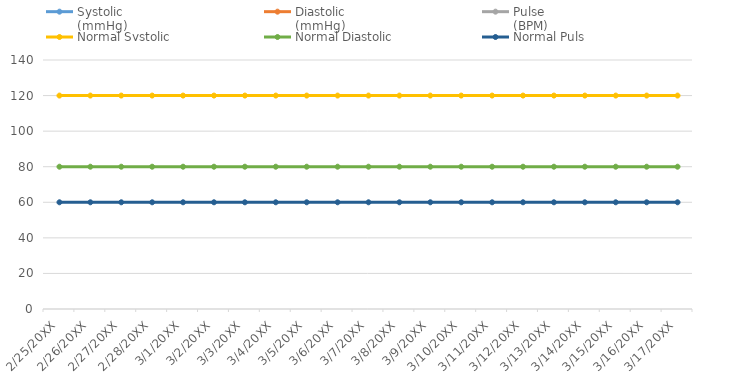
| Category | Systolic 
(mmHg) | Diastolic 
(mmHg) | Pulse 
(BPM) | Normal Systolic | Normal Diastolic | Normal Puls |
|---|---|---|---|---|---|---|
| 2/25/20XX |  |  |  | 120 | 80 | 60 |
| 2/26/20XX |  |  |  | 120 | 80 | 60 |
| 2/27/20XX |  |  |  | 120 | 80 | 60 |
| 2/28/20XX |  |  |  | 120 | 80 | 60 |
| 3/1/20XX |  |  |  | 120 | 80 | 60 |
| 3/2/20XX |  |  |  | 120 | 80 | 60 |
| 3/3/20XX |  |  |  | 120 | 80 | 60 |
| 3/4/20XX |  |  |  | 120 | 80 | 60 |
| 3/5/20XX |  |  |  | 120 | 80 | 60 |
| 3/6/20XX |  |  |  | 120 | 80 | 60 |
| 3/7/20XX |  |  |  | 120 | 80 | 60 |
| 3/8/20XX |  |  |  | 120 | 80 | 60 |
| 3/9/20XX |  |  |  | 120 | 80 | 60 |
| 3/10/20XX |  |  |  | 120 | 80 | 60 |
| 3/11/20XX |  |  |  | 120 | 80 | 60 |
| 3/12/20XX |  |  |  | 120 | 80 | 60 |
| 3/13/20XX |  |  |  | 120 | 80 | 60 |
| 3/14/20XX |  |  |  | 120 | 80 | 60 |
| 3/15/20XX |  |  |  | 120 | 80 | 60 |
| 3/16/20XX |  |  |  | 120 | 80 | 60 |
| 3/17/20XX |  |  |  | 120 | 80 | 60 |